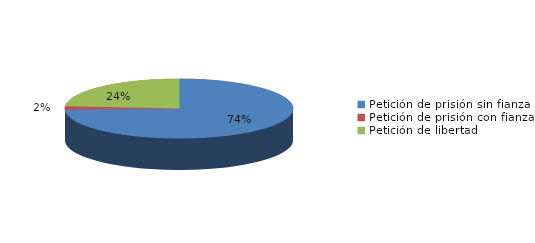
| Category | Series 0 |
|---|---|
| Petición de prisión sin fianza | 379 |
| Petición de prisión con fianza | 10 |
| Petición de libertad | 121 |